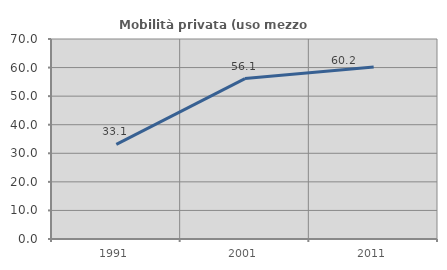
| Category | Mobilità privata (uso mezzo privato) |
|---|---|
| 1991.0 | 33.134 |
| 2001.0 | 56.134 |
| 2011.0 | 60.196 |